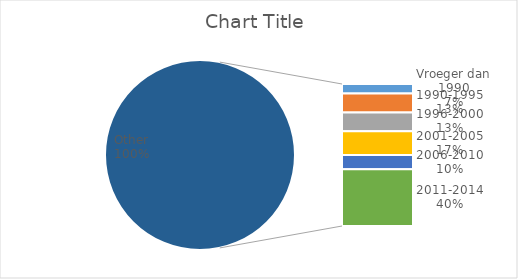
| Category | Series 0 |
|---|---|
| Vroeger dan 1990 | 2 |
| 1990-1995 | 4 |
| 1996-2000 | 4 |
| 2001-2005 | 5 |
| 2006-2010 | 3 |
| 2011-2014 | 12 |